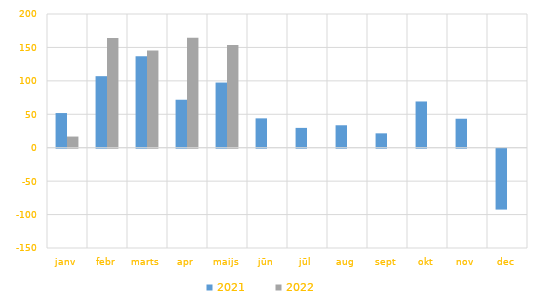
| Category | 2021 | 2022 |
|---|---|---|
| janv | 51841.777 | 16703.923 |
| febr | 107011.894 | 164205.671 |
| marts | 136866.315 | 145513.563 |
| apr | 71755.584 | 164636.583 |
| maijs | 97451.146 | 153483.094 |
| jūn | 43904.827 | 0 |
| jūl | 29653.452 | 0 |
| aug | 33579 | 0 |
| sept | 21501.571 | 0 |
| okt | 69163.685 | 0 |
| nov | 43347 | 0 |
| dec | -91047.788 | 0 |